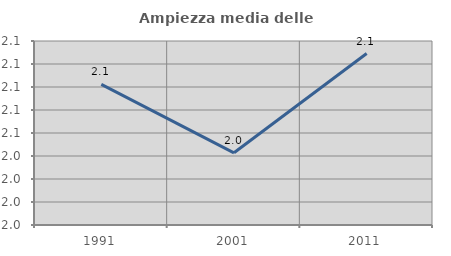
| Category | Ampiezza media delle famiglie |
|---|---|
| 1991.0 | 2.102 |
| 2001.0 | 2.043 |
| 2011.0 | 2.129 |